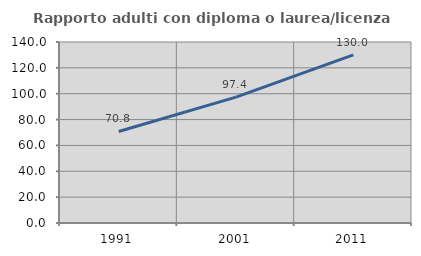
| Category | Rapporto adulti con diploma o laurea/licenza media  |
|---|---|
| 1991.0 | 70.807 |
| 2001.0 | 97.402 |
| 2011.0 | 129.986 |